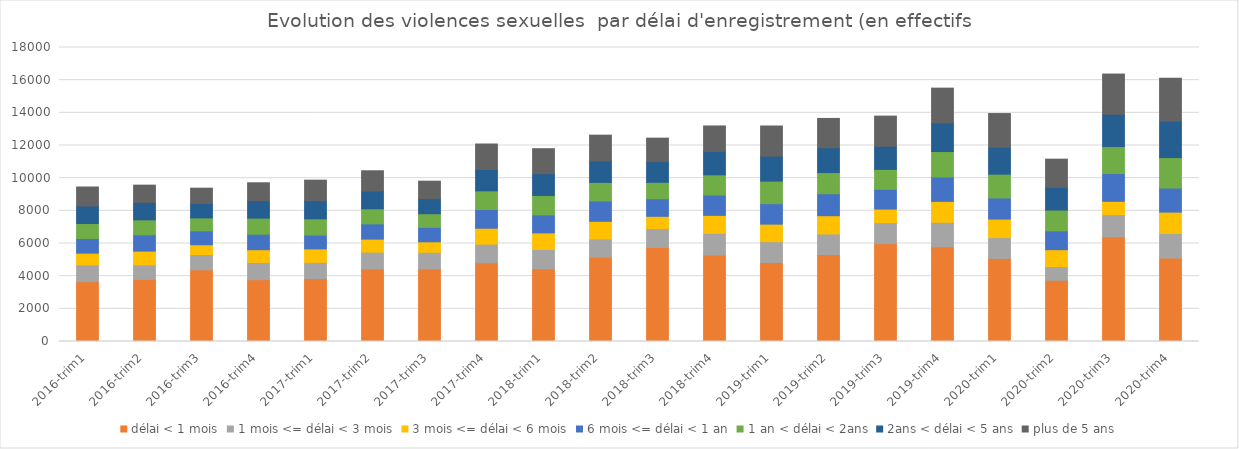
| Category | délai < 1 mois | 1 mois <= délai < 3 mois | 3 mois <= délai < 6 mois | 6 mois <= délai < 1 an | 1 an < délai < 2ans | 2ans < délai < 5 ans | plus de 5 ans |
|---|---|---|---|---|---|---|---|
| 2016-trim1 | 3663 | 1018 | 729 | 891 | 921 | 1076 | 1161 |
| 2016-trim2 | 3802 | 892 | 841 | 998 | 915 | 1067 | 1057 |
| 2016-trim3 | 4390 | 938 | 595 | 852 | 791 | 890 | 931 |
| 2016-trim4 | 3784 | 1058 | 777 | 948 | 987 | 1064 | 1100 |
| 2017-trim1 | 3854 | 990 | 826 | 844 | 996 | 1108 | 1260 |
| 2017-trim2 | 4447 | 1026 | 795 | 935 | 922 | 1085 | 1243 |
| 2017-trim3 | 4442 | 1021 | 641 | 884 | 835 | 927 | 1066 |
| 2017-trim4 | 4814 | 1144 | 977 | 1145 | 1143 | 1307 | 1561 |
| 2018-trim1 | 4452 | 1180 | 1018 | 1100 | 1191 | 1333 | 1530 |
| 2018-trim2 | 5166 | 1110 | 1083 | 1245 | 1136 | 1316 | 1576 |
| 2018-trim3 | 5753 | 1160 | 751 | 1078 | 1004 | 1262 | 1442 |
| 2018-trim4 | 5291 | 1332 | 1100 | 1242 | 1239 | 1425 | 1568 |
| 2019-trim1 | 4839 | 1272 | 1074 | 1254 | 1381 | 1530 | 1844 |
| 2019-trim2 | 5327 | 1257 | 1117 | 1344 | 1300 | 1518 | 1794 |
| 2019-trim3 | 5989 | 1282 | 839 | 1209 | 1218 | 1416 | 1846 |
| 2019-trim4 | 5798 | 1500 | 1281 | 1494 | 1557 | 1752 | 2130 |
| 2020-trim1 | 5088 | 1272 | 1136 | 1292 | 1457 | 1653 | 2058 |
| 2020-trim2 | 3747 | 842 | 1033 | 1152 | 1273 | 1388 | 1727 |
| 2020-trim3 | 6412 | 1356 | 817 | 1697 | 1654 | 1976 | 2462 |
| 2020-trim4 | 5111 | 1502 | 1308 | 1473 | 1867 | 2219 | 2634 |